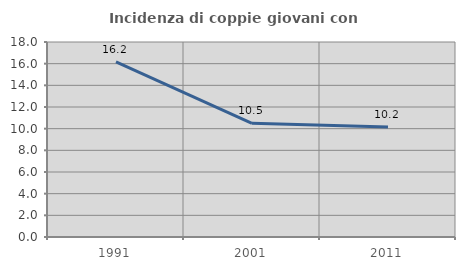
| Category | Incidenza di coppie giovani con figli |
|---|---|
| 1991.0 | 16.17 |
| 2001.0 | 10.494 |
| 2011.0 | 10.156 |